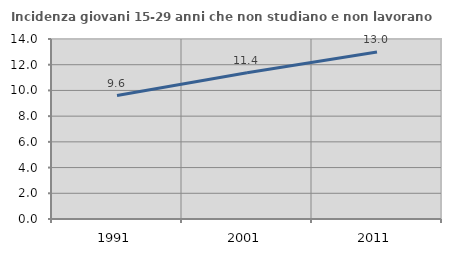
| Category | Incidenza giovani 15-29 anni che non studiano e non lavorano  |
|---|---|
| 1991.0 | 9.6 |
| 2001.0 | 11.368 |
| 2011.0 | 12.992 |